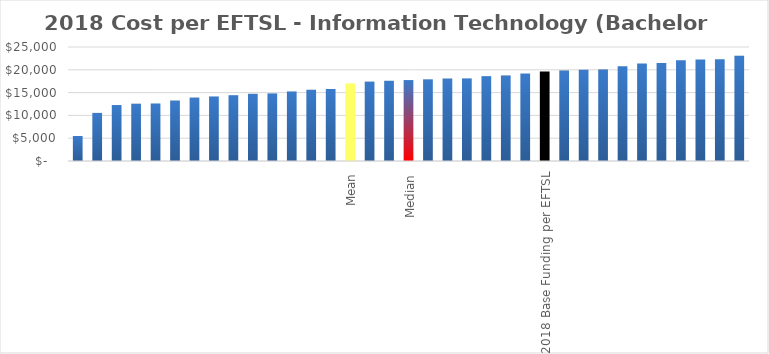
| Category | Series 0 |
|---|---|
|  | 5483.42 |
|  | 10548.61 |
|  | 12271.817 |
|  | 12561.328 |
|  | 12617.227 |
|  | 13252.033 |
|  | 13901.715 |
|  | 14154.023 |
|  | 14431.759 |
|  | 14733.745 |
|  | 14827.646 |
|  | 15255.684 |
|  | 15619.317 |
|  | 15784.495 |
| Mean | 17010.97 |
|  | 17402.918 |
|  | 17587.953 |
| Median | 17750.403 |
|  | 17912.853 |
|  | 18076.773 |
|  | 18115.396 |
|  | 18605.884 |
|  | 18738.47 |
|  | 19210.056 |
| 2018 Base Funding per EFTSL | 19617 |